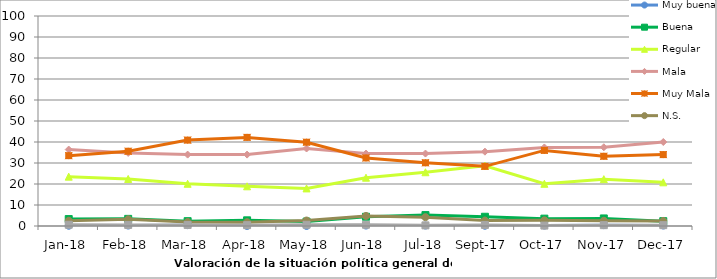
| Category | Muy buena | Buena | Regular | Mala | Muy Mala | N.S. | N.C. |
|---|---|---|---|---|---|---|---|
| 2018-01-01 | 0.1 | 3.3 | 23.5 | 36.4 | 33.5 | 2.5 | 0.6 |
| 2018-02-01 | 0.2 | 3.4 | 22.4 | 34.8 | 35.6 | 3.2 | 0.5 |
| 2018-03-01 | 0.4 | 2.3 | 20.1 | 34 | 40.9 | 1.9 | 0.5 |
| 2018-04-01 | 0 | 2.7 | 18.9 | 34 | 42.2 | 1.8 | 0.4 |
| 2018-05-01 | 0 | 2.1 | 17.9 | 36.9 | 39.9 | 2.6 | 0.6 |
| 2018-06-01 | 0.2 | 4.4 | 23 | 34.5 | 32.4 | 4.8 | 0.6 |
| 2018-07-01 | 0.2 | 5.2 | 25.6 | 34.5 | 30.1 | 4.2 | 0.3 |
| 2017-09-01 | 0.1 | 4.4 | 28.7 | 35.4 | 28.4 | 2.6 | 0.5 |
| 2017-10-01 | 0.2 | 3.5 | 20.1 | 37.4 | 36 | 2.7 | 0.2 |
| 2017-11-01 | 0.4 | 3.6 | 22.3 | 37.5 | 33.2 | 2.5 | 0.4 |
| 2017-12-01 | 0.2 | 2.3 | 20.8 | 40 | 34 | 2.4 | 0.4 |